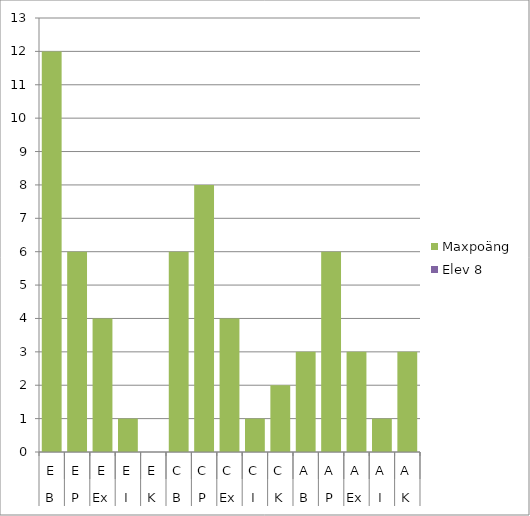
| Category | Maxpoäng | Elev 8 |
|---|---|---|
| 0 | 12 | 0 |
| 1 | 6 | 0 |
| 2 | 4 | 0 |
| 3 | 1 | 0 |
| 4 | 0 | 0 |
| 5 | 6 | 0 |
| 6 | 8 | 0 |
| 7 | 4 | 0 |
| 8 | 1 | 0 |
| 9 | 2 | 0 |
| 10 | 3 | 0 |
| 11 | 6 | 0 |
| 12 | 3 | 0 |
| 13 | 1 | 0 |
| 14 | 3 | 0 |